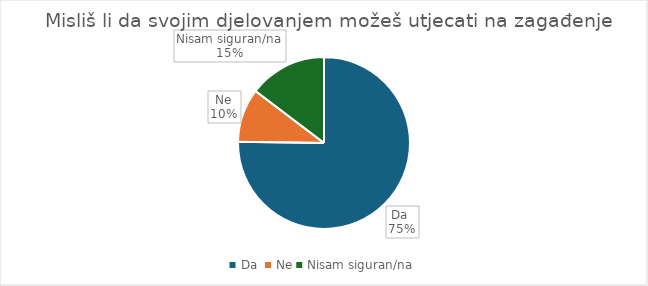
| Category | Series 0 |
|---|---|
| Da  | 82 |
| Ne | 11 |
| Nisam siguran/na | 16 |